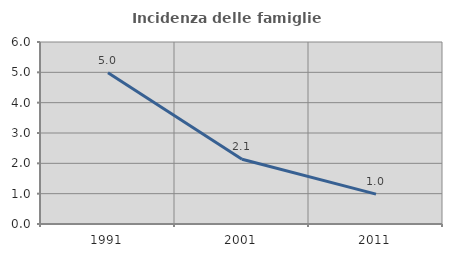
| Category | Incidenza delle famiglie numerose |
|---|---|
| 1991.0 | 4.985 |
| 2001.0 | 2.134 |
| 2011.0 | 0.984 |